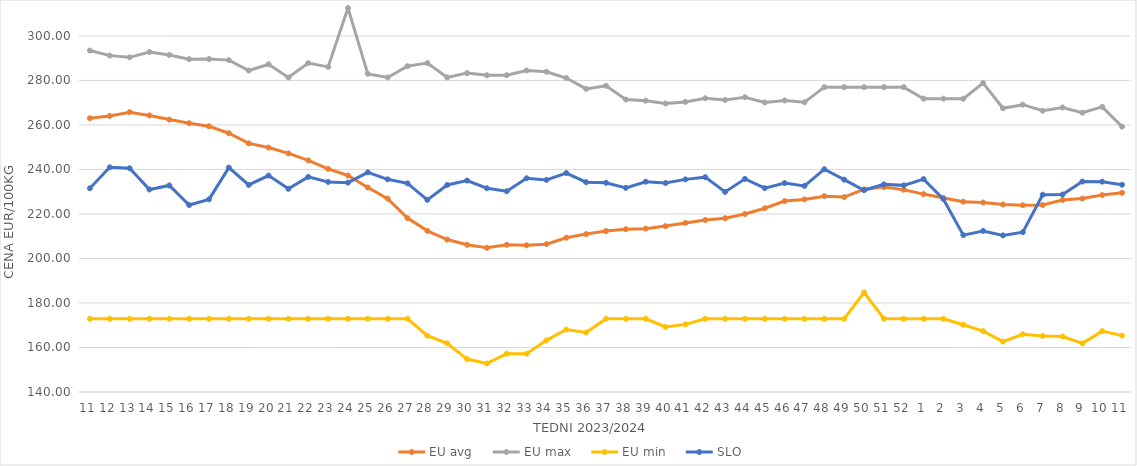
| Category | EU avg | EU max | EU min | SLO |
|---|---|---|---|---|
| 11.0 | 263.049 | 293.44 | 172.91 | 231.56 |
| 12.0 | 264.068 | 291.15 | 172.91 | 240.97 |
| 13.0 | 265.73 | 290.38 | 172.91 | 240.55 |
| 14.0 | 264.262 | 292.763 | 172.91 | 230.99 |
| 15.0 | 262.411 | 291.46 | 172.91 | 232.82 |
| 16.0 | 260.77 | 289.56 | 172.91 | 224 |
| 17.0 | 259.395 | 289.61 | 172.91 | 226.57 |
| 18.0 | 256.275 | 289.13 | 172.91 | 240.83 |
| 19.0 | 251.716 | 284.45 | 172.91 | 233.05 |
| 20.0 | 249.836 | 287.26 | 172.91 | 237.25 |
| 21.0 | 247.212 | 281.33 | 172.91 | 231.3 |
| 22.0 | 244.103 | 287.77 | 172.91 | 236.67 |
| 23.0 | 240.279 | 286.1 | 172.91 | 234.39 |
| 24.0 | 237.289 | 312.54 | 172.91 | 234.08 |
| 25.0 | 231.895 | 282.95 | 172.91 | 238.69 |
| 26.0 | 226.903 | 281.34 | 172.91 | 235.57 |
| 27.0 | 218.126 | 286.43 | 172.91 | 233.75 |
| 28.0 | 212.406 | 287.8 | 165.32 | 226.35 |
| 29.0 | 208.504 | 281.37 | 161.87 | 233.03 |
| 30.0 | 206.149 | 283.3 | 154.8 | 235 |
| 31.0 | 204.79 | 282.32 | 152.83 | 231.55 |
| 32.0 | 206.16 | 282.36 | 157.23 | 230.2 |
| 33.0 | 205.917 | 284.5 | 157.23 | 236.04 |
| 34.0 | 206.436 | 283.9 | 163.21 | 235.32 |
| 35.0 | 209.326 | 281.09 | 168.085 | 238.39 |
| 36.0 | 210.957 | 276.21 | 166.745 | 234.27 |
| 37.0 | 212.325 | 277.59 | 172.91 | 234 |
| 38.0 | 213.132 | 271.4 | 172.91 | 231.74 |
| 39.0 | 213.398 | 270.91 | 172.91 | 234.5 |
| 40.0 | 214.548 | 269.62 | 169.209 | 233.92 |
| 41.0 | 215.966 | 270.36 | 170.387 | 235.54 |
| 42.0 | 217.294 | 271.99 | 172.91 | 236.54 |
| 43.0 | 218.091 | 271.22 | 172.91 | 229.92 |
| 44.0 | 219.965 | 272.45 | 172.91 | 235.77 |
| 45.0 | 222.584 | 270.09 | 172.91 | 231.6 |
| 46.0 | 225.795 | 270.99 | 172.91 | 233.89 |
| 47.0 | 226.547 | 270.18 | 172.91 | 232.62 |
| 48.0 | 227.993 | 276.99 | 172.91 | 240.11 |
| 49.0 | 227.575 | 276.99 | 172.91 | 235.41 |
| 50.0 | 231.099 | 276.99 | 184.72 | 230.65 |
| 51.0 | 232.088 | 276.99 | 172.91 | 233.3 |
| 52.0 | 230.884 | 276.99 | 172.91 | 232.85 |
| 1.0 | 228.928 | 271.8 | 172.91 | 235.66 |
| 2.0 | 227.213 | 271.8 | 172.91 | 226.65 |
| 3.0 | 225.533 | 271.8 | 170.2 | 210.5 |
| 4.0 | 225.142 | 278.81 | 167.37 | 212.37 |
| 5.0 | 224.262 | 267.49 | 162.66 | 210.38 |
| 6.0 | 223.902 | 269.11 | 165.95 | 211.82 |
| 7.0 | 224.031 | 266.38 | 165.18 | 228.66 |
| 8.0 | 226.285 | 267.85 | 164.92 | 228.73 |
| 9.0 | 226.925 | 265.51 | 161.84 | 234.57 |
| 10.0 | 228.496 | 268.11 | 167.35 | 234.52 |
| 11.0 | 229.515 | 259.24 | 165.34 | 233.13 |